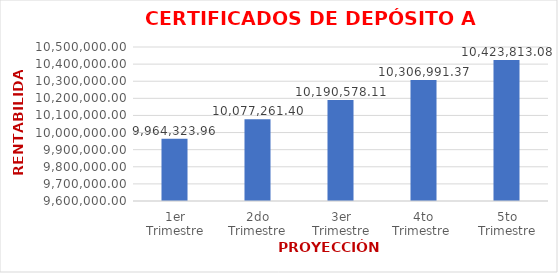
| Category | CDT´s |
|---|---|
| 1er Trimestre | 9964323.957 |
| 2do Trimestre | 10077261.404 |
| 3er Trimestre | 10190578.108 |
| 4to Trimestre  | 10306991.369 |
| 5to Trimestre | 10423813.077 |